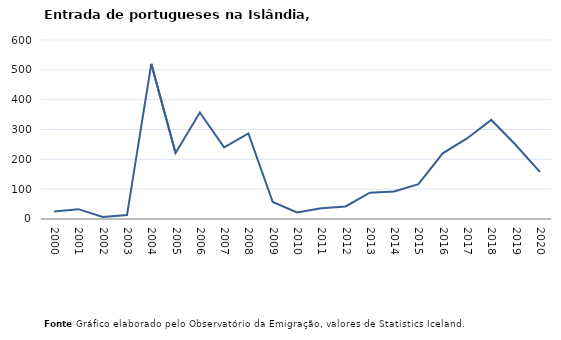
| Category | Entradas |
|---|---|
| 2000.0 | 25 |
| 2001.0 | 33 |
| 2002.0 | 7 |
| 2003.0 | 13 |
| 2004.0 | 520 |
| 2005.0 | 221 |
| 2006.0 | 357 |
| 2007.0 | 240 |
| 2008.0 | 287 |
| 2009.0 | 57 |
| 2010.0 | 22 |
| 2011.0 | 36 |
| 2012.0 | 42 |
| 2013.0 | 88 |
| 2014.0 | 92 |
| 2015.0 | 117 |
| 2016.0 | 220 |
| 2017.0 | 270 |
| 2018.0 | 332 |
| 2019.0 | 249 |
| 2020.0 | 158 |